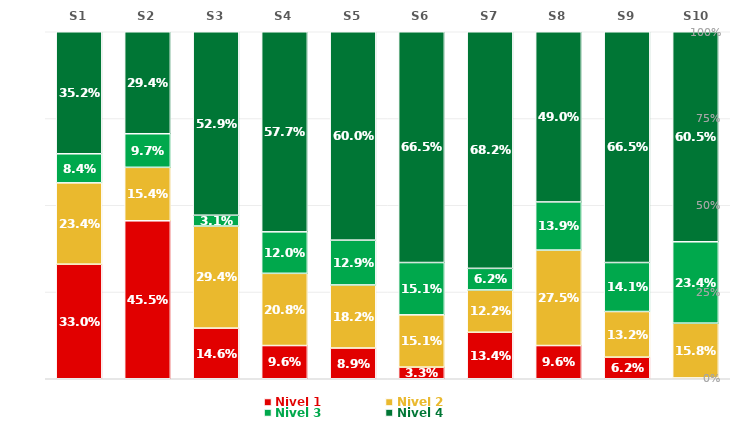
| Category | Nivel 1 | Nivel 2 | Nivel 3 | Nivel 4 |
|---|---|---|---|---|
| S1 | 0.33 | 0.234 | 0.084 | 0.352 |
| S2 | 0.455 | 0.154 | 0.097 | 0.294 |
| S3 | 0.146 | 0.294 | 0.031 | 0.529 |
| S4 | 0.096 | 0.208 | 0.12 | 0.577 |
| S5 | 0.089 | 0.182 | 0.129 | 0.6 |
| S6 | 0.033 | 0.151 | 0.151 | 0.665 |
| S7 | 0.134 | 0.122 | 0.062 | 0.682 |
| S8 | 0.096 | 0.275 | 0.139 | 0.49 |
| S9 | 0.062 | 0.132 | 0.141 | 0.665 |
| S10 | 0.002 | 0.158 | 0.234 | 0.605 |